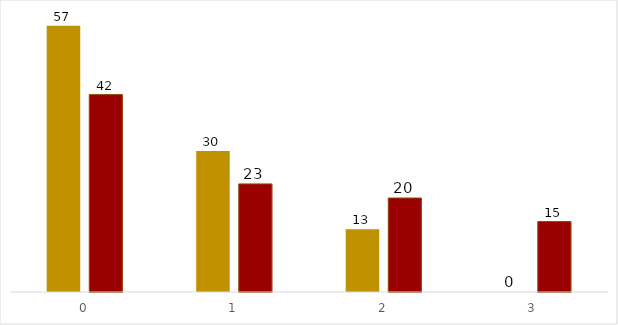
| Category | CRT com esgotamento do ego | CRT |
|---|---|---|
| 0.0 | 0.567 | 0.42 |
| 1.0 | 0.3 | 0.23 |
| 2.0 | 0.133 | 0.2 |
| 3.0 | 0 | 0.15 |